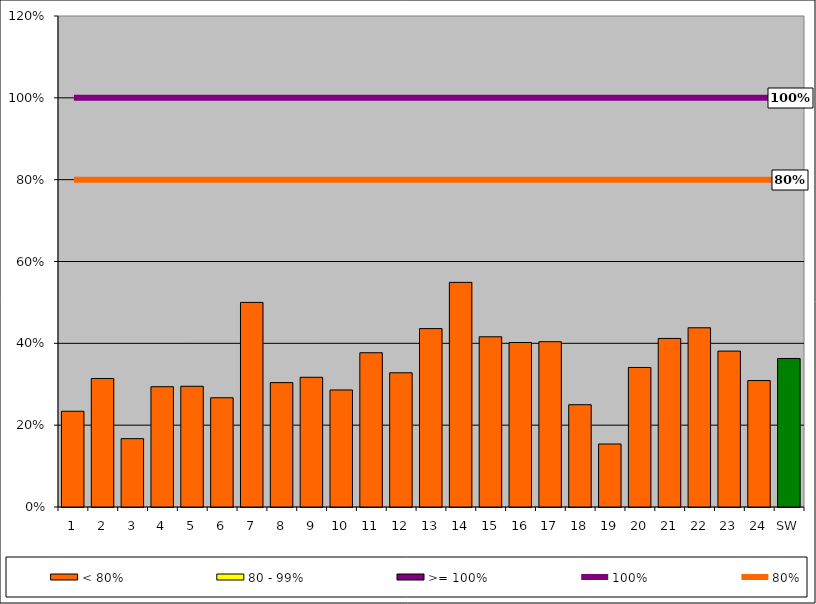
| Category | < 80% | 80 - 99% | >= 100% |
|---|---|---|---|
| 1 | 0.234 | 0 | 0 |
| 2 | 0.314 | 0 | 0 |
| 3 | 0.167 | 0 | 0 |
| 4 | 0.294 | 0 | 0 |
| 5 | 0.295 | 0 | 0 |
| 6 | 0.267 | 0 | 0 |
| 7 | 0.5 | 0 | 0 |
| 8 | 0.304 | 0 | 0 |
| 9 | 0.317 | 0 | 0 |
| 10 | 0.286 | 0 | 0 |
| 11 | 0.377 | 0 | 0 |
| 12 | 0.328 | 0 | 0 |
| 13 | 0.436 | 0 | 0 |
| 14 | 0.549 | 0 | 0 |
| 15 | 0.416 | 0 | 0 |
| 16 | 0.402 | 0 | 0 |
| 17 | 0.404 | 0 | 0 |
| 18 | 0.25 | 0 | 0 |
| 19 | 0.154 | 0 | 0 |
| 20 | 0.341 | 0 | 0 |
| 21 | 0.412 | 0 | 0 |
| 22 | 0.438 | 0 | 0 |
| 23 | 0.381 | 0 | 0 |
| 24 | 0.309 | 0 | 0 |
| SW | 0.363 | 0 | 0 |